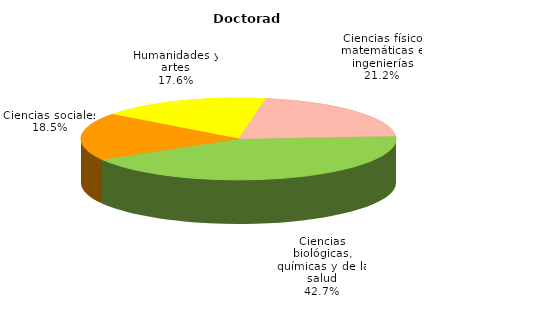
| Category | Series 0 |
|---|---|
| Ciencias físico matemáticas e ingenierías | 1088 |
| Ciencias biológicas, químicas y de la salud | 2188 |
| Ciencias sociales | 949 |
| Humanidades y artes | 904 |